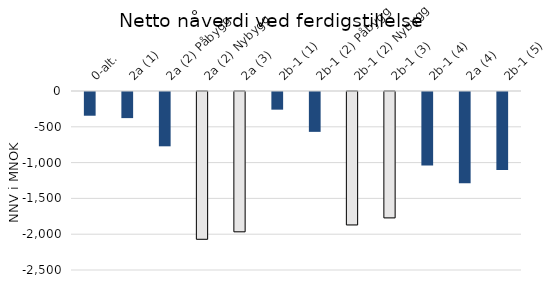
| Category | NNV pr. alt (MNOK) |
|---|---|
| 0-alt. | -331.252 |
| 2a (1) | -364.711 |
| 2a (2) Påbygg | -758.469 |
| 2a (2) Nybygg | -2064.064 |
| 2a (3) | -1959.785 |
| 2b-1 (1) | -246.734 |
| 2b-1 (2) Påbygg | -556.714 |
| 2b-1 (2) Nybygg | -1863.654 |
| 2b-1 (3) | -1765.052 |
| 2b-1 (4) | -1027.804 |
| 2a (4) | -1273.705 |
| 2b-1 (5) | -1088.705 |